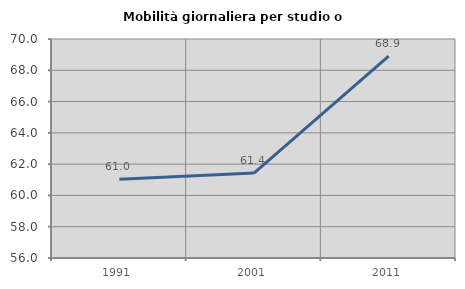
| Category | Mobilità giornaliera per studio o lavoro |
|---|---|
| 1991.0 | 61.034 |
| 2001.0 | 61.427 |
| 2011.0 | 68.9 |